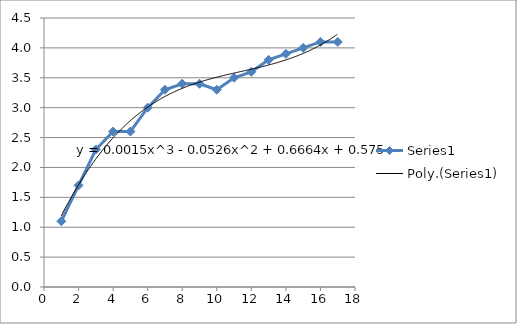
| Category | Series 0 |
|---|---|
| 1.0 | 1.1 |
| 2.0 | 1.7 |
| 3.0 | 2.3 |
| 4.0 | 2.6 |
| 5.0 | 2.6 |
| 6.0 | 3 |
| 7.0 | 3.3 |
| 8.0 | 3.4 |
| 9.0 | 3.4 |
| 10.0 | 3.3 |
| 11.0 | 3.5 |
| 12.0 | 3.6 |
| 13.0 | 3.8 |
| 14.0 | 3.9 |
| 15.0 | 4 |
| 16.0 | 4.1 |
| 17.0 | 4.1 |